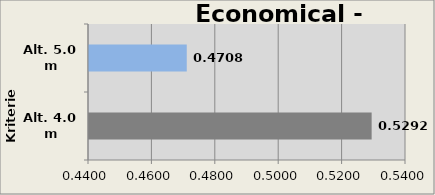
| Category | P. Scenario |
|---|---|
| Alt. 4.0 m | 0.529 |
| Alt. 5.0 m | 0.471 |